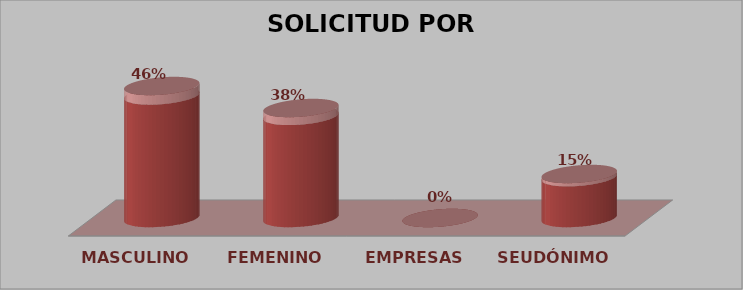
| Category | SOLICITUD POR GÉNERO | Series 1 |
|---|---|---|
| MASCULINO | 6 | 0.462 |
| FEMENINO | 5 | 0.385 |
| EMPRESAS | 0 | 0 |
| SEUDÓNIMO | 2 | 0.154 |